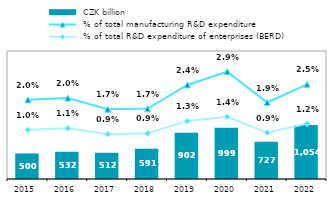
| Category |  CZK billion |
|---|---|
| 2015.0 | 499.552 |
| 2016.0 | 531.732 |
| 2017.0 | 512.334 |
| 2018.0 | 591.173 |
| 2019.0 | 901.621 |
| 2020.0 | 998.727 |
| 2021.0 | 727.253 |
| 2022.0 | 1053.542 |